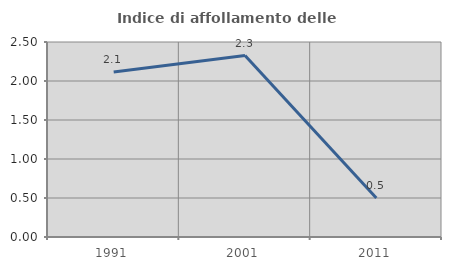
| Category | Indice di affollamento delle abitazioni  |
|---|---|
| 1991.0 | 2.115 |
| 2001.0 | 2.326 |
| 2011.0 | 0.499 |